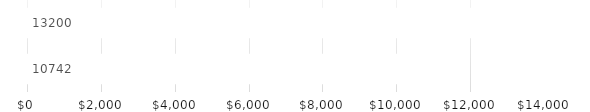
| Category | ANNUAL TOTALS |
|---|---|
| INCOME | 10742 |
| EXPENDITURES | 13200 |